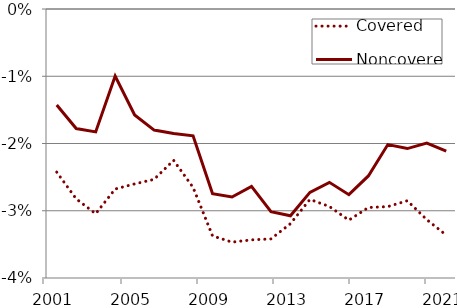
| Category | Covered | Noncovered |
|---|---|---|
| 2001.0 | -0.024 | -0.014 |
| 2002.0 | -0.028 | -0.018 |
| 2003.0 | -0.03 | -0.018 |
| 2004.0 | -0.027 | -0.01 |
| 2005.0 | -0.026 | -0.016 |
| 2006.0 | -0.025 | -0.018 |
| 2007.0 | -0.022 | -0.019 |
| 2008.0 | -0.027 | -0.019 |
| 2009.0 | -0.034 | -0.027 |
| 2010.0 | -0.035 | -0.028 |
| 2011.0 | -0.034 | -0.026 |
| 2012.0 | -0.034 | -0.03 |
| 2013.0 | -0.032 | -0.031 |
| 2014.0 | -0.028 | -0.027 |
| 2015.0 | -0.029 | -0.026 |
| 2016.0 | -0.031 | -0.028 |
| 2017.0 | -0.03 | -0.025 |
| 2018.0 | -0.029 | -0.02 |
| 2019.0 | -0.029 | -0.021 |
| 2020.0 | -0.031 | -0.02 |
| 2021.0 | -0.034 | -0.021 |